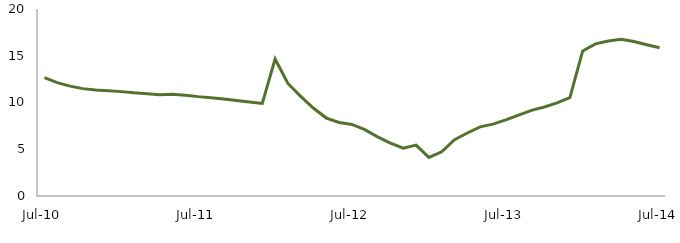
| Category | Series 0 |
|---|---|
| Jul-10 | 12.669 |
|  | 12.128 |
|  | 11.747 |
|  | 11.483 |
|  | 11.344 |
|  | 11.256 |
|  | 11.163 |
|  | 11.031 |
|  | 10.935 |
|  | 10.818 |
|  | 10.872 |
|  | 10.784 |
| Jul-11 | 10.628 |
|  | 10.504 |
|  | 10.374 |
|  | 10.212 |
|  | 10.043 |
|  | 9.898 |
|  | 14.655 |
|  | 12.038 |
|  | 10.656 |
|  | 9.383 |
|  | 8.337 |
|  | 7.859 |
| Jul-12 | 7.654 |
|  | 7.095 |
|  | 6.329 |
|  | 5.655 |
|  | 5.108 |
|  | 5.447 |
|  | 4.125 |
|  | 4.723 |
|  | 6.024 |
|  | 6.741 |
|  | 7.399 |
|  | 7.69 |
| Jul-13 | 8.139 |
|  | 8.641 |
|  | 9.159 |
|  | 9.523 |
|  | 9.953 |
|  | 10.521 |
|  | 15.512 |
|  | 16.267 |
|  | 16.584 |
|  | 16.774 |
|  | 16.523 |
|  | 16.177 |
| Jul-14 | 15.851 |